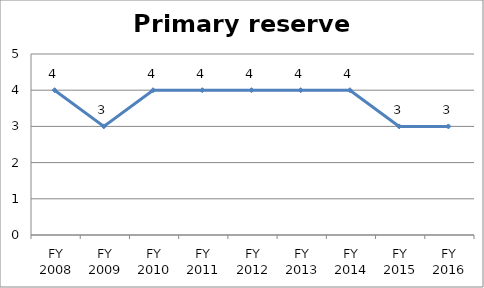
| Category | Primary reserve score |
|---|---|
| FY 2016 | 3 |
| FY 2015 | 3 |
| FY 2014 | 4 |
| FY 2013 | 4 |
| FY 2012 | 4 |
| FY 2011 | 4 |
| FY 2010 | 4 |
| FY 2009 | 3 |
| FY 2008 | 4 |